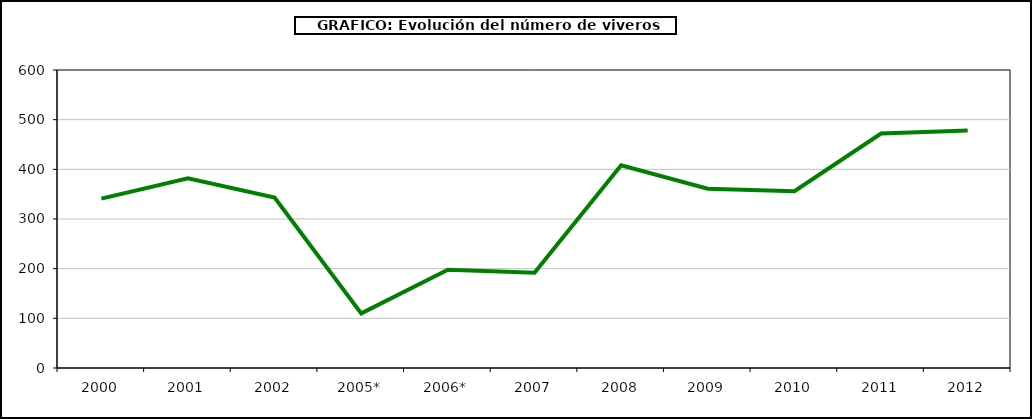
| Category | Series 0 |
|---|---|
| 2000 | 341 |
| 2001 | 382 |
| 2002 | 343 |
| 2005* | 110 |
| 2006* | 198 |
| 2007 | 192 |
| 2008 | 408 |
| 2009 | 361 |
| 2010 | 356 |
| 2011 | 472 |
| 2012 | 478 |